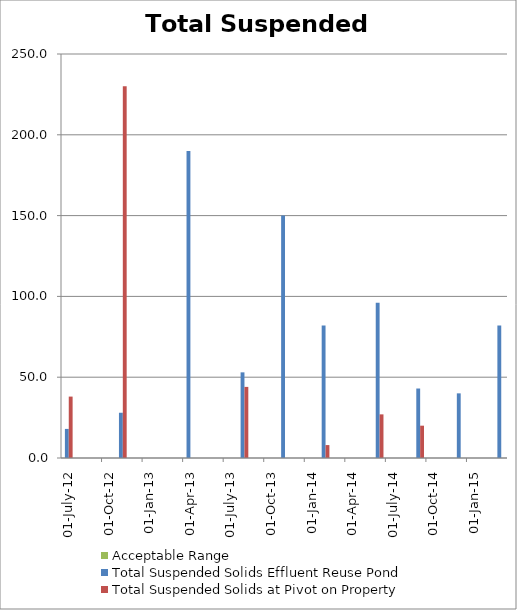
| Category | Total Suspended Solids Effluent Reuse Pond | Total Suspended Solids at Pivot on Property |
|---|---|---|
| 2012-07-01 | 18 | 38 |
| 2012-11-14 | 28 | 230 |
| 2013-04-03 | 190 | 0 |
| 2013-08-05 | 53 | 44 |
| 2013-11-05 | 150 | 0 |
| 2014-02-18 | 82 | 8 |
| 2014-06-10 | 96 | 27 |
| 2014-09-23 | 43 | 20 |
| 2014-12-10 | 40 | 0 |
| 2015-03-17 | 82 | 0 |